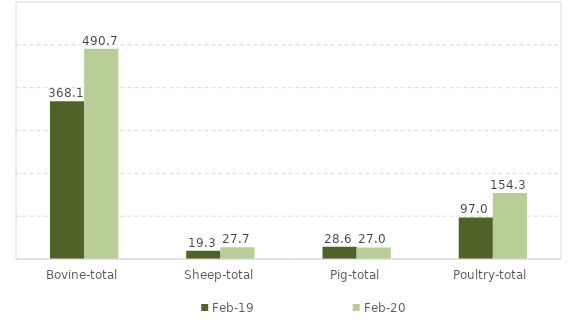
| Category | Feb-19 | Feb-20 |
|---|---|---|
| Bovine-total | 368.1 | 490.7 |
| Sheep-total | 19.3 | 27.7 |
| Pig-total | 28.6 | 27 |
| Poultry-total | 97 | 154.3 |